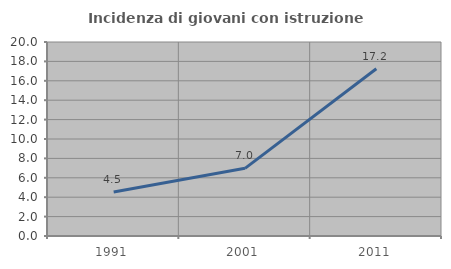
| Category | Incidenza di giovani con istruzione universitaria |
|---|---|
| 1991.0 | 4.545 |
| 2001.0 | 6.977 |
| 2011.0 | 17.241 |